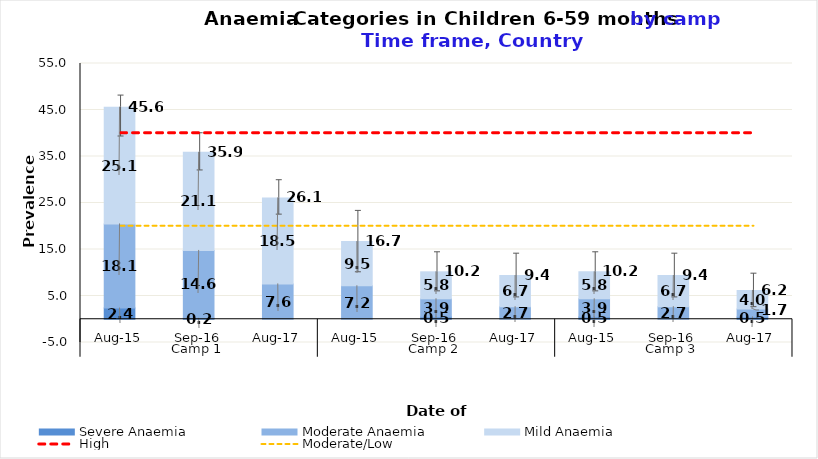
| Category | Severe Anaemia | Moderate Anaemia | Mild Anaemia |
|---|---|---|---|
| 0 | 2.4 | 18.1 | 25.1 |
| 1 | 0.2 | 14.6 | 21.1 |
| 2 | 0 | 7.6 | 18.5 |
| 3 | 0 | 7.2 | 9.5 |
| 4 | 0.5 | 3.9 | 5.8 |
| 5 | 0 | 2.7 | 6.7 |
| 6 | 0.5 | 3.9 | 5.8 |
| 7 | 0 | 2.7 | 6.7 |
| 8 | 0.5 | 1.7 | 4 |